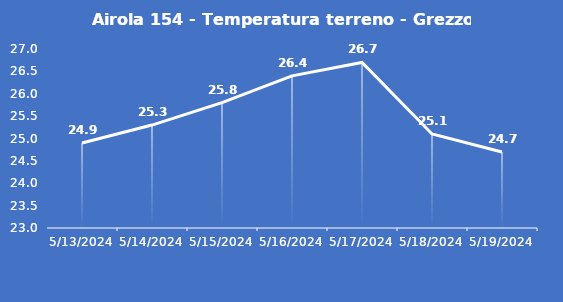
| Category | Airola 154 - Temperatura terreno - Grezzo (°C) |
|---|---|
| 5/13/24 | 24.9 |
| 5/14/24 | 25.3 |
| 5/15/24 | 25.8 |
| 5/16/24 | 26.4 |
| 5/17/24 | 26.7 |
| 5/18/24 | 25.1 |
| 5/19/24 | 24.7 |